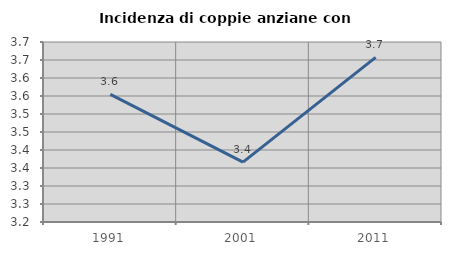
| Category | Incidenza di coppie anziane con figli |
|---|---|
| 1991.0 | 3.555 |
| 2001.0 | 3.366 |
| 2011.0 | 3.657 |